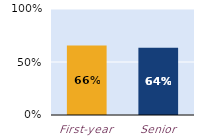
| Category | substantially |
|---|---|
| First-year | 0.656 |
| Senior | 0.635 |